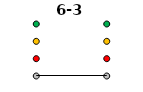
| Category | 0 | 1 | 2 | 3 | 6-3 |
|---|---|---|---|---|---|
| Time 1 | 0 | 1 | 2 | 3 | 0 |
| Time 2 | 0 | 1 | 2 | 3 | 0 |